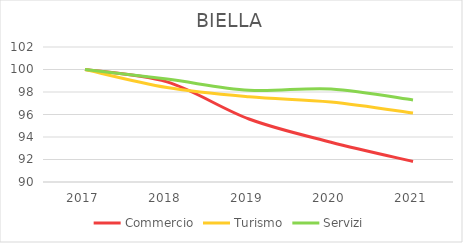
| Category | Commercio | Turismo | Servizi |
|---|---|---|---|
| 2017.0 | 100 | 100 | 100 |
| 2018.0 | 98.895 | 98.398 | 99.147 |
| 2019.0 | 95.6 | 97.571 | 98.155 |
| 2020.0 | 93.538 | 97.106 | 98.272 |
| 2021.0 | 91.826 | 96.124 | 97.291 |